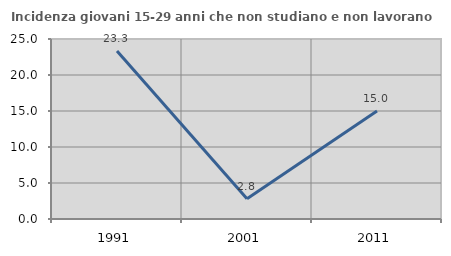
| Category | Incidenza giovani 15-29 anni che non studiano e non lavorano  |
|---|---|
| 1991.0 | 23.327 |
| 2001.0 | 2.817 |
| 2011.0 | 15 |